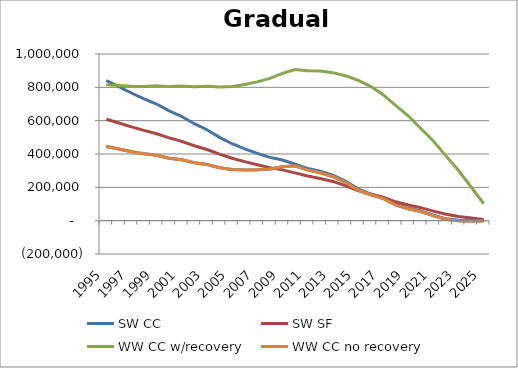
| Category | SW CC | SW SF | WW CC w/recovery | WW CC no recovery |
|---|---|---|---|---|
| 1995.0 | 840989.69 | 608234.788 | 815703.002 | 445330.932 |
| 1996.0 | 804067.38 | 585965.832 | 811079.873 | 429596.641 |
| 1997.0 | 766037.402 | 563028.807 | 806318.049 | 413390.321 |
| 1998.0 | 731256.524 | 541598.671 | 805613.372 | 400897.811 |
| 1999.0 | 699822.22 | 521720.631 | 809087.553 | 392230.526 |
| 2000.0 | 658664.886 | 496856.25 | 804265.961 | 374903.222 |
| 2001.0 | 625052.833 | 475635.937 | 807699.72 | 365456.1 |
| 2002.0 | 581652.418 | 449389.016 | 802836.492 | 347325.563 |
| 2003.0 | 545729.99 | 426744.686 | 806227.368 | 337051.111 |
| 2004.0 | 499949.89 | 399031.027 | 801319.97 | 318068.425 |
| 2005.0 | 461576.387 | 374875.957 | 804665.349 | 306916.258 |
| 2006.0 | 430831.678 | 354386.236 | 816511.09 | 303829.527 |
| 2007.0 | 403554.629 | 335476.823 | 832912.204 | 304850.193 |
| 2008.0 | 379849.268 | 318195.128 | 854005.351 | 310101.48 |
| 2009.0 | 364212.746 | 304784.982 | 884131.292 | 323910.305 |
| 2010.0 | 339327.128 | 286582.531 | 906761.011 | 329733.395 |
| 2011.0 | 313694.942 | 267834.007 | 899043.842 | 304705.396 |
| 2012.0 | 296073.79 | 252913.027 | 897815.157 | 287326.558 |
| 2013.0 | 273534.004 | 235349.418 | 888149.612 | 265226.355 |
| 2014.0 | 237148.024 | 210673.901 | 869794.1 | 229863.146 |
| 2015.0 | 190890.465 | 180868.118 | 842487.923 | 185039.04 |
| 2016.0 | 160805.178 | 158948.161 | 805962.561 | 155670.211 |
| 2017.0 | 138597.334 | 140760.606 | 755741.437 | 133820.318 |
| 2018.0 | 98163.254 | 113247.424 | 691413.681 | 94514.927 |
| 2019.0 | 74076.151 | 93688.847 | 629356.091 | 70830.375 |
| 2020.0 | 58046.436 | 77933.512 | 552836.774 | 54835.286 |
| 2021.0 | 32755.829 | 57315.518 | 478221.877 | 29960.345 |
| 2022.0 | 11096.504 | 38273.983 | 388768.533 | 8539.155 |
| 2023.0 | 1957.399 | 25246.203 | 300831.589 | -924.67 |
| 2024.0 | 1324.121 | 16217.589 | 201856.537 | -2272.41 |
| 2025.0 | 671.845 | 7796.117 | 101592.233 | -1980.583 |